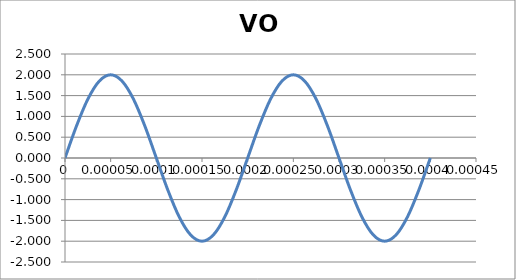
| Category | VO |
|---|---|
| 0.0 | 0 |
| 1.25e-05 | 0.765 |
| 2.5e-05 | 1.414 |
| 3.7500000000000003e-05 | 1.848 |
| 5e-05 | 2 |
| 6.25e-05 | 1.848 |
| 7.500000000000001e-05 | 1.414 |
| 8.75e-05 | 0.765 |
| 0.0001 | 0 |
| 0.00011250000000000001 | -0.765 |
| 0.000125 | -1.414 |
| 0.0001375 | -1.848 |
| 0.00015000000000000001 | -2 |
| 0.00016250000000000002 | -1.848 |
| 0.000175 | -1.414 |
| 0.0001875 | -0.765 |
| 0.0002 | 0 |
| 0.00021250000000000002 | 0.765 |
| 0.00022500000000000002 | 1.414 |
| 0.0002375 | 1.848 |
| 0.00025 | 2 |
| 0.00026250000000000004 | 1.848 |
| 0.000275 | 1.414 |
| 0.0002875 | 0.765 |
| 0.00030000000000000003 | 0 |
| 0.0003125 | -0.765 |
| 0.00032500000000000004 | -1.414 |
| 0.0003375 | -1.848 |
| 0.00035 | -2 |
| 0.00036250000000000003 | -1.848 |
| 0.000375 | -1.414 |
| 0.00038750000000000004 | -0.765 |
| 0.0004 | 0 |